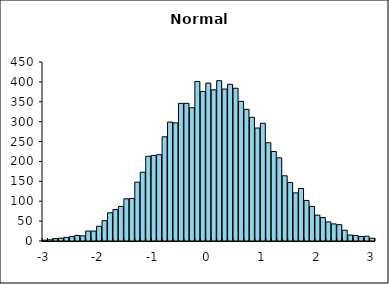
| Category | Series 0 |
|---|---|
| -3.0 | 2 |
| -2.9 | 3 |
| -2.8 | 6 |
| -2.7 | 7 |
| -2.6 | 9 |
| -2.5 | 11 |
| -2.4 | 14 |
| -2.3 | 13 |
| -2.2 | 25 |
| -2.1 | 25 |
| -2.0 | 37 |
| -1.9 | 51 |
| -1.8 | 71 |
| -1.7 | 79 |
| -1.6 | 87 |
| -1.5 | 106 |
| -1.4 | 107 |
| -1.3 | 148 |
| -1.2 | 173 |
| -1.1 | 213 |
| -1.0 | 215 |
| -0.9 | 217 |
| -0.8 | 262 |
| -0.7 | 299 |
| -0.6 | 297 |
| -0.5 | 346 |
| -0.4 | 346 |
| -0.3 | 335 |
| -0.2 | 401 |
| -0.1 | 376 |
| 0.0 | 397 |
| 0.1 | 380 |
| 0.2 | 403 |
| 0.3 | 382 |
| 0.4 | 394 |
| 0.5 | 384 |
| 0.6 | 351 |
| 0.7 | 331 |
| 0.8 | 311 |
| 0.9 | 284 |
| 1.0 | 296 |
| 1.1 | 247 |
| 1.2 | 225 |
| 1.3 | 209 |
| 1.4 | 164 |
| 1.5 | 147 |
| 1.6 | 121 |
| 1.7 | 132 |
| 1.8 | 102 |
| 1.9 | 87 |
| 2.0 | 65 |
| 2.1 | 59 |
| 2.2 | 48 |
| 2.3 | 43 |
| 2.40000000000001 | 41 |
| 2.5 | 27 |
| 2.6 | 15 |
| 2.70000000000001 | 14 |
| 2.80000000000001 | 11 |
| 2.90000000000001 | 12 |
| 3.0 | 7 |